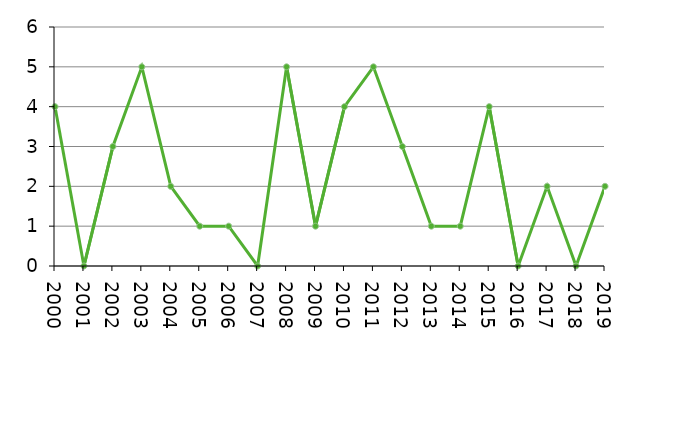
| Category | Avlidna |
|---|---|
| 2000 | 4 |
| 2001 | 0 |
| 2002 | 3 |
| 2003 | 5 |
| 2004 | 2 |
| 2005 | 1 |
| 2006 | 1 |
| 2007 | 0 |
| 2008 | 5 |
| 2009 | 1 |
| 2010 | 4 |
| 2011 | 5 |
| 2012 | 3 |
| 2013 | 1 |
| 2014 | 1 |
| 2015 | 4 |
| 2016 | 0 |
| 2017 | 2 |
| 2018 | 0 |
| 2019 | 2 |